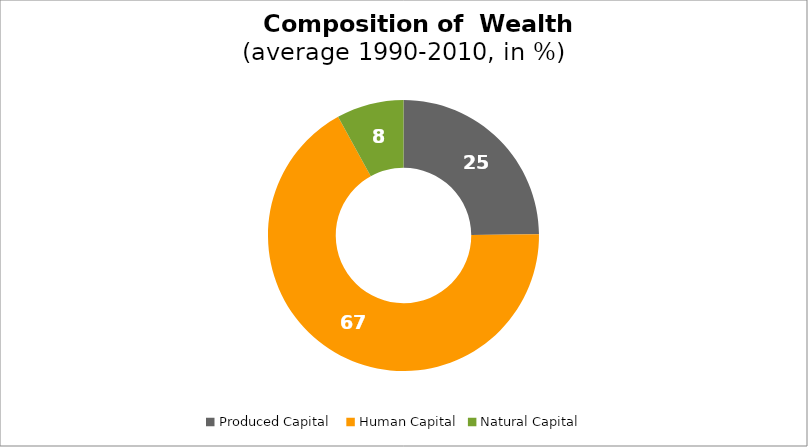
| Category | Series 0 |
|---|---|
| Produced Capital  | 24.854 |
| Human Capital | 67.126 |
| Natural Capital | 8.02 |